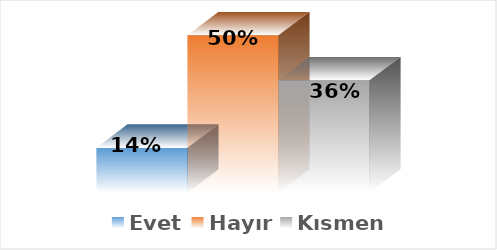
| Category | Evet | Hayır | Kısmen |
|---|---|---|---|
| 0 | 0.143 | 0.5 | 0.357 |